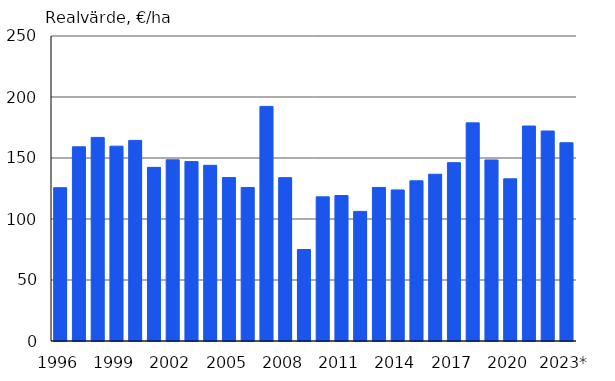
| Category | Realvärde, €/ha |
|---|---|
| 1996 | 125.639 |
| 1997 | 159.179 |
| 1998 | 166.88 |
| 1999 | 159.708 |
| 2000 | 164.437 |
| 2001 | 142.325 |
| 2002 | 148.513 |
| 2003 | 147.049 |
| 2004 | 144.009 |
| 2005 | 133.957 |
| 2006 | 125.841 |
| 2007 | 192.3 |
| 2008 | 133.911 |
| 2009 | 74.985 |
| 2010 | 118.144 |
| 2011 | 119.235 |
| 2012 | 106.235 |
| 2013 | 125.855 |
| 2014 | 123.816 |
| 2015 | 131.303 |
| 2016 | 136.704 |
| 2017 | 146.196 |
| 2018 | 178.8 |
| 2019 | 148.4 |
| 2020 | 132.945 |
| 2021 | 176.213 |
| 2022 | 172.12 |
| 2023* | 162.5 |